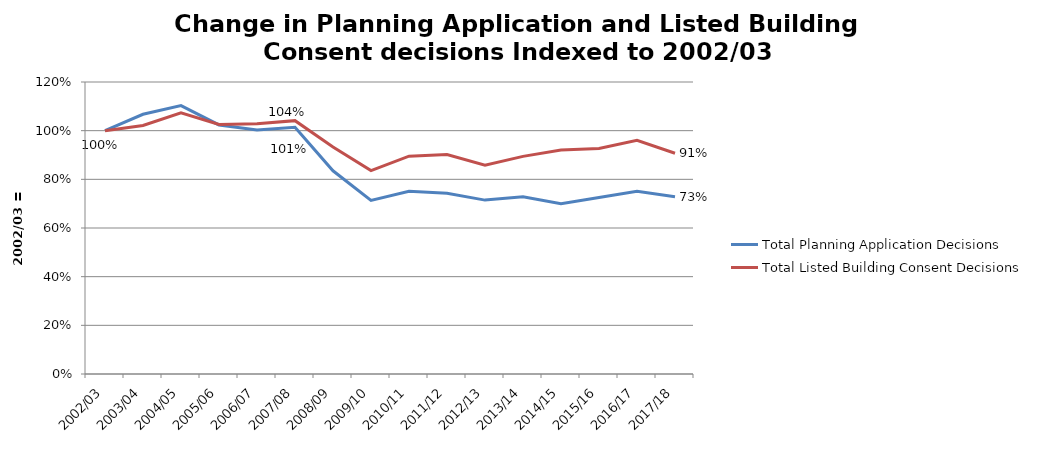
| Category | Total Planning Application Decisions | Total Listed Building Consent Decisions |
|---|---|---|
| 2002/03 | 1 | 1 |
| 2003/04 | 1.067 | 1.021 |
| 2004/05 | 1.103 | 1.073 |
| 2005/06 | 1.024 | 1.025 |
| 2006/07 | 1.003 | 1.028 |
| 2007/08 | 1.014 | 1.041 |
| 2008/09 | 0.835 | 0.933 |
| 2009/10 | 0.713 | 0.836 |
| 2010/11 | 0.751 | 0.895 |
| 2011/12 | 0.743 | 0.902 |
| 2012/13 | 0.715 | 0.858 |
| 2013/14 | 0.728 | 0.894 |
| 2014/15 | 0.7 | 0.921 |
| 2015/16 | 0.725 | 0.927 |
| 2016/17 | 0.751 | 0.96 |
| 2017/18 | 0.728 | 0.907 |